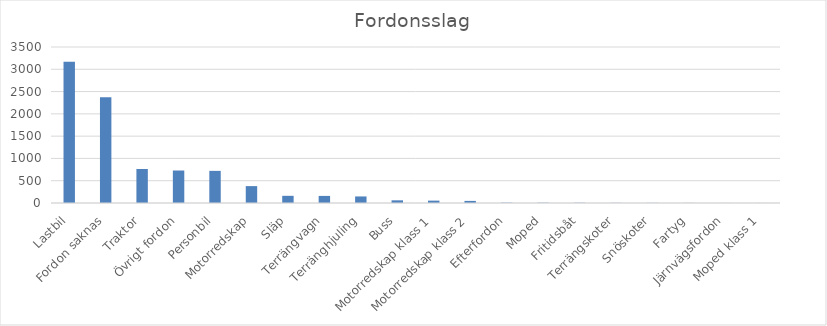
| Category | Summa |
|---|---|
| Lastbil | 3170 |
| Fordon saknas | 2370 |
| Traktor | 763 |
| Övrigt fordon | 729 |
| Personbil | 721 |
| Motorredskap | 379 |
| Släp | 161 |
| Terrängvagn | 159 |
| Terränghjuling | 147 |
| Buss | 60 |
| Motorredskap klass 1 | 53 |
| Motorredskap klass 2 | 47 |
| Efterfordon | 7 |
| Moped | 6 |
| Fritidsbåt | 5 |
| Terrängskoter | 3 |
| Snöskoter | 3 |
| Fartyg | 2 |
| Järnvägsfordon | 1 |
| Moped klass 1 | 1 |